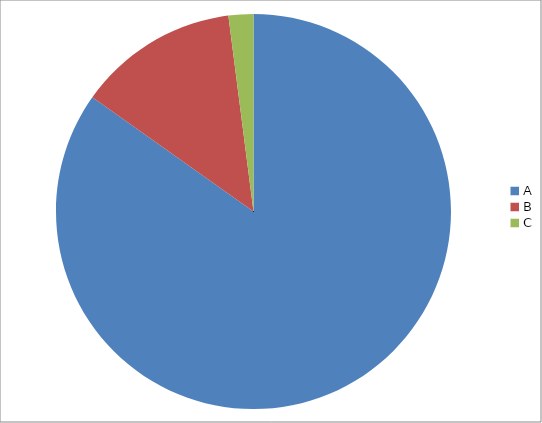
| Category | Series 0 | Series 1 |
|---|---|---|
| A | 11600 | 0.848 |
| B | 1800 | 0.132 |
| C | 278 | 0.02 |